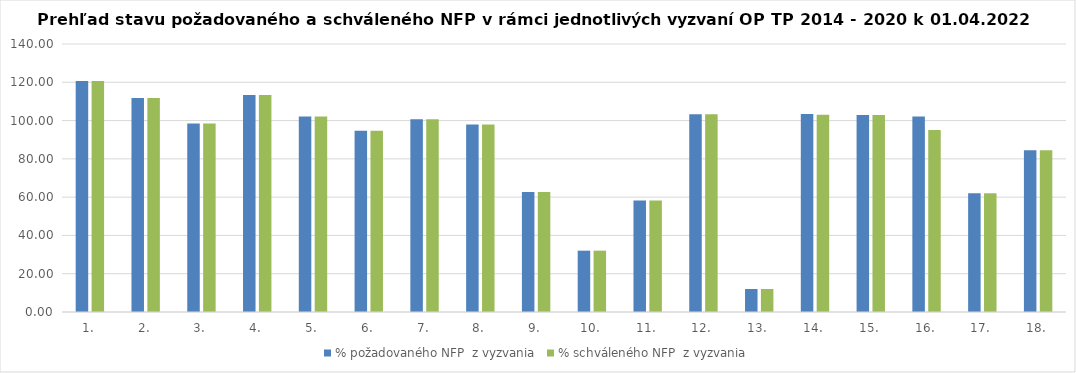
| Category | % požadovaného NFP  z vyzvania | % schváleného NFP  z vyzvania |
|---|---|---|
| 1. | 120.662 | 120.662 |
| 2. | 111.83 | 111.83 |
| 3. | 98.465 | 98.465 |
| 4. | 113.295 | 113.295 |
| 5. | 102.19 | 102.19 |
| 6. | 94.643 | 94.643 |
| 7. | 100.637 | 100.637 |
| 8. | 97.989 | 97.989 |
| 9. | 62.721 | 62.721 |
| 10. | 32.038 | 32.038 |
| 11. | 58.283 | 58.283 |
| 12. | 103.242 | 103.242 |
| 13. | 12.008 | 12.008 |
| 14. | 103.392 | 103.084 |
| 15. | 102.872 | 102.872 |
| 16. | 102.176 | 95.126 |
| 17. | 61.969 | 61.969 |
| 18. | 84.514 | 84.514 |